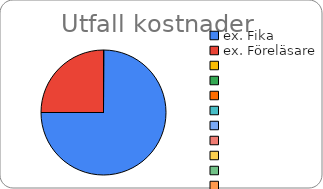
| Category | Series 0 |
|---|---|
| ex. Fika  | 150 |
| ex. Föreläsare | 50 |